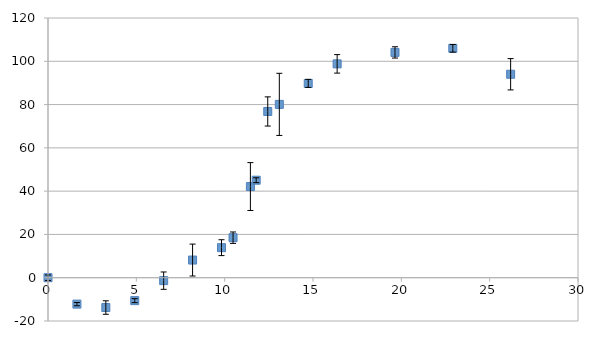
| Category | Series 0 |
|---|---|
| 0.0 | 0 |
| 1.63666666666667 | -12.201 |
| 3.27333333333333 | -13.783 |
| 4.91 | -10.594 |
| 6.54666666666667 | -1.358 |
| 8.18333333333333 | 8.159 |
| 9.82 | 13.883 |
| 10.4746666666667 | 18.497 |
| 11.4566666666667 | 42.121 |
| 11.784 | 45.053 |
| 12.4386666666667 | 76.815 |
| 13.0933333333333 | 80.088 |
| 14.73 | 89.778 |
| 16.3666666666667 | 98.811 |
| 19.64 | 104.104 |
| 22.9133333333333 | 105.993 |
| 26.1866666666667 | 94.007 |